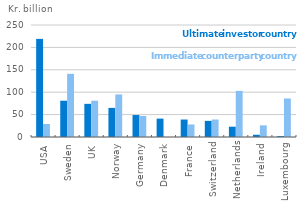
| Category | Ultimate investor country | Immediate counterparty country |
|---|---|---|
| USA | 219 | 29 |
| Sweden | 81 | 141 |
| UK | 74 | 81 |
| Norway | 65 | 95 |
| Germany | 49 | 47 |
| Denmark | 41 | 0 |
| France | 39 | 28 |
| Switzerland | 36 | 39 |
| Netherlands | 23 | 103 |
| Ireland | 5 | 26 |
| Luxembourg | 2 | 86 |